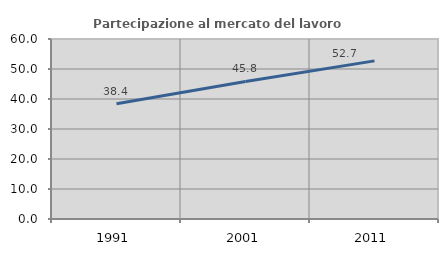
| Category | Partecipazione al mercato del lavoro  femminile |
|---|---|
| 1991.0 | 38.389 |
| 2001.0 | 45.835 |
| 2011.0 | 52.709 |